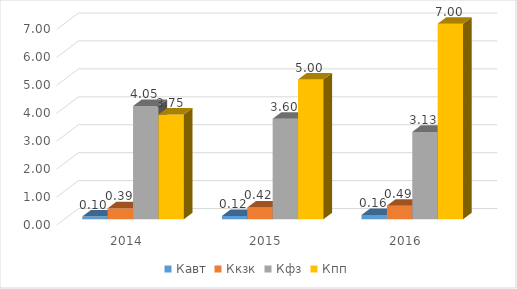
| Category | Кавт | Ккзк | Кфз | Кпп |
|---|---|---|---|---|
| 2014.0 | 0.097 | 0.394 | 4.053 | 3.75 |
| 2015.0 | 0.118 | 0.423 | 3.598 | 5 |
| 2016.0 | 0.155 | 0.486 | 3.128 | 7 |